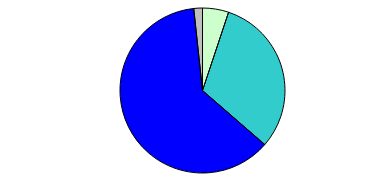
| Category | Series 0 |
|---|---|
| 0 | 0 |
| 1 | 0 |
| 2 | 9 |
| 3 | 55 |
| 4 | 109 |
| 5 | 3 |